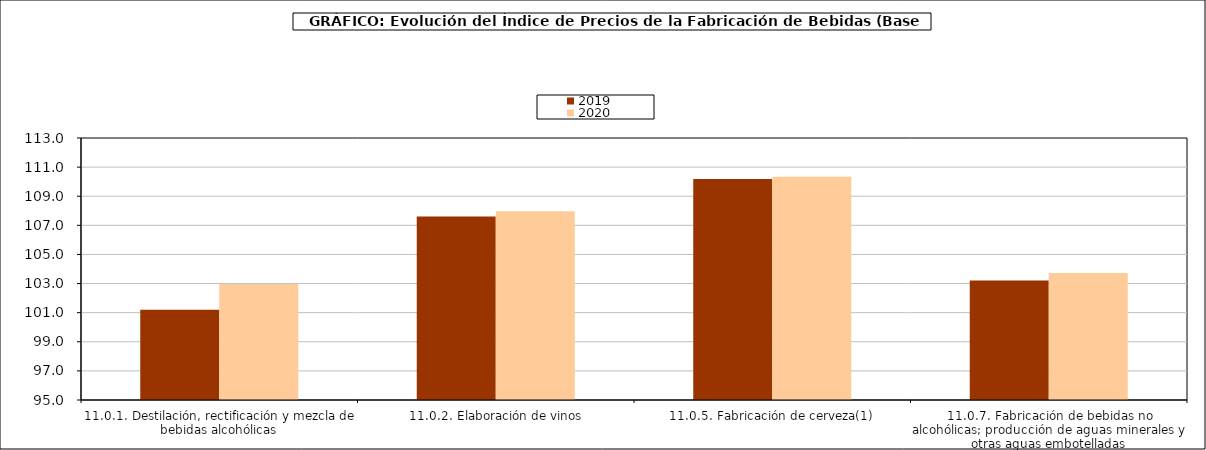
| Category | 2019 | 2020 |
|---|---|---|
| 11.0.1. Destilación, rectificación y mezcla de bebidas alcohólicas | 101.196 | 102.967 |
| 11.0.2. Elaboración de vinos | 107.607 | 107.966 |
| 11.0.5. Fabricación de cerveza(1) | 110.184 | 110.346 |
| 11.0.7. Fabricación de bebidas no alcohólicas; producción de aguas minerales y otras aguas embotelladas | 103.205 | 103.721 |